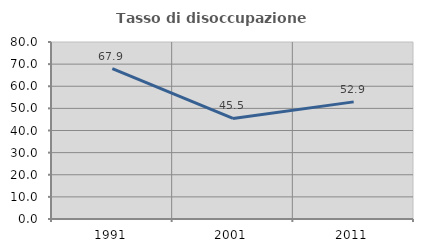
| Category | Tasso di disoccupazione giovanile  |
|---|---|
| 1991.0 | 67.925 |
| 2001.0 | 45.455 |
| 2011.0 | 52.941 |